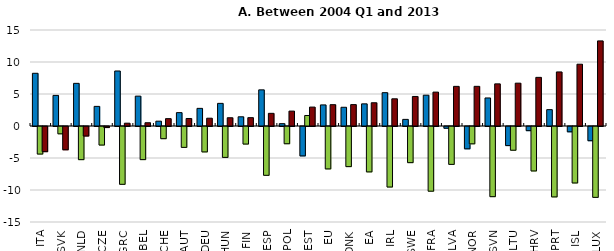
| Category | Low skilled | Middle skilled | High skilled |
|---|---|---|---|
| ITA | 8.236 | -4.304 | -3.932 |
| SVK | 4.781 | -1.143 | -3.637 |
| NLD | 6.663 | -5.178 | -1.485 |
| CZE | 3.064 | -2.899 | -0.165 |
| GRC | 8.595 | -9.033 | 0.438 |
| BEL | 4.666 | -5.174 | 0.509 |
| CHE | 0.753 | -1.903 | 1.15 |
| AUT | 2.09 | -3.263 | 1.173 |
| DEU | 2.755 | -3.971 | 1.217 |
| HUN | 3.537 | -4.827 | 1.29 |
| FIN | 1.44 | -2.744 | 1.304 |
| ESP | 5.649 | -7.629 | 1.98 |
| POL | 0.366 | -2.693 | 2.327 |
| EST | -4.596 | 1.641 | 2.955 |
| EU | 3.296 | -6.628 | 3.332 |
| DNK | 2.925 | -6.269 | 3.344 |
| EA | 3.461 | -7.093 | 3.633 |
| IRL | 5.207 | -9.457 | 4.25 |
| SWE | 1.033 | -5.649 | 4.615 |
| FRA | 4.814 | -10.108 | 5.293 |
| LVA | -0.273 | -5.918 | 6.191 |
| NOR | -3.488 | -2.708 | 6.197 |
| SVN | 4.38 | -10.963 | 6.583 |
| LTU | -2.984 | -3.708 | 6.692 |
| HRV | -0.65 | -6.948 | 7.598 |
| PRT | 2.555 | -11.001 | 8.447 |
| ISL | -0.83 | -8.825 | 9.655 |
| LUX | -2.222 | -11.072 | 13.294 |